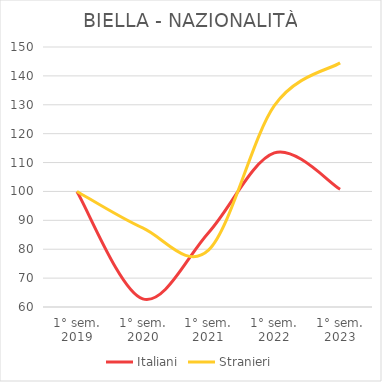
| Category | Italiani | Stranieri |
|---|---|---|
| 1° sem.
2019 | 100 | 100 |
| 1° sem.
2020 | 62.836 | 87.363 |
| 1° sem.
2021 | 85.738 | 79.67 |
| 1° sem.
2022 | 113.339 | 129.67 |
| 1° sem.
2023 | 100.755 | 144.505 |